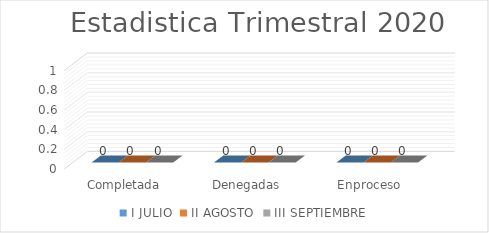
| Category | I JULIO | II AGOSTO | III SEPTIEMBRE |
|---|---|---|---|
| Completada | 0 | 0 | 0 |
| Denegadas | 0 | 0 | 0 |
| Enproceso | 0 | 0 | 0 |